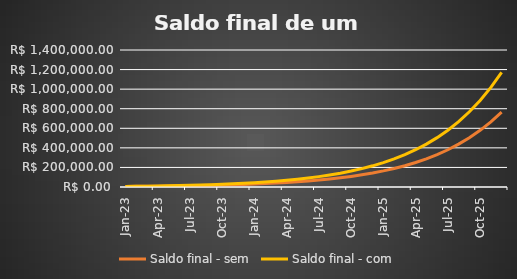
| Category | Saldo final - sem |  Saldo final - com  |
|---|---|---|
| 2023-01-01 | 5750 | 5750 |
| 2023-02-01 | 6612.5 | 7072.5 |
| 2023-03-01 | 7604.375 | 8593.375 |
| 2023-04-01 | 8745.031 | 10342.381 |
| 2023-05-01 | 10056.786 | 12353.738 |
| 2023-06-01 | 11565.304 | 14666.799 |
| 2023-07-01 | 13300.099 | 17326.819 |
| 2023-08-01 | 15295.114 | 20385.842 |
| 2023-09-01 | 17589.381 | 23903.718 |
| 2023-10-01 | 20227.789 | 27949.276 |
| 2023-11-01 | 23261.957 | 32601.667 |
| 2023-12-01 | 26751.251 | 37951.917 |
| 2024-01-01 | 30763.938 | 44104.705 |
| 2024-02-01 | 35378.529 | 51180.411 |
| 2024-03-01 | 40685.308 | 59317.472 |
| 2024-04-01 | 46788.104 | 68675.093 |
| 2024-05-01 | 53806.32 | 79436.357 |
| 2024-06-01 | 61877.268 | 91811.811 |
| 2024-07-01 | 71158.858 | 106043.583 |
| 2024-08-01 | 81832.687 | 122410.12 |
| 2024-09-01 | 94107.59 | 141231.638 |
| 2024-10-01 | 108223.729 | 162876.384 |
| 2024-11-01 | 124457.288 | 187767.841 |
| 2024-12-01 | 143125.881 | 216393.017 |
| 2025-01-01 | 164594.763 | 249311.97 |
| 2025-02-01 | 189283.978 | 287168.766 |
| 2025-03-01 | 217676.574 | 330704.08 |
| 2025-04-01 | 250328.06 | 380769.693 |
| 2025-05-01 | 287877.269 | 438345.146 |
| 2025-06-01 | 331058.86 | 504556.918 |
| 2025-07-01 | 380717.689 | 580700.456 |
| 2025-08-01 | 437825.342 | 668265.524 |
| 2025-09-01 | 503499.143 | 768965.353 |
| 2025-10-01 | 579024.015 | 884770.156 |
| 2025-11-01 | 665877.617 | 1017945.68 |
| 2025-12-01 | 765759.26 | 1171097.532 |